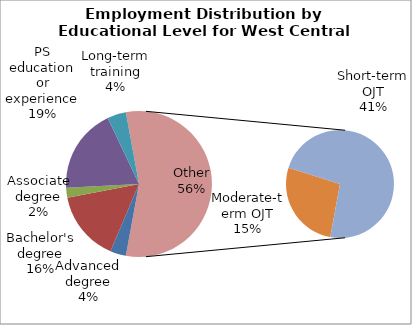
| Category | Series 0 |
|---|---|
| Advanced degree | 2900 |
| Bachelor's degree | 12850 |
| Associate degree | 1850 |
| PS education or experience | 15490 |
| Long-term training | 3430 |
| Moderate-term OJT | 12430 |
| Short-term OJT | 33630 |